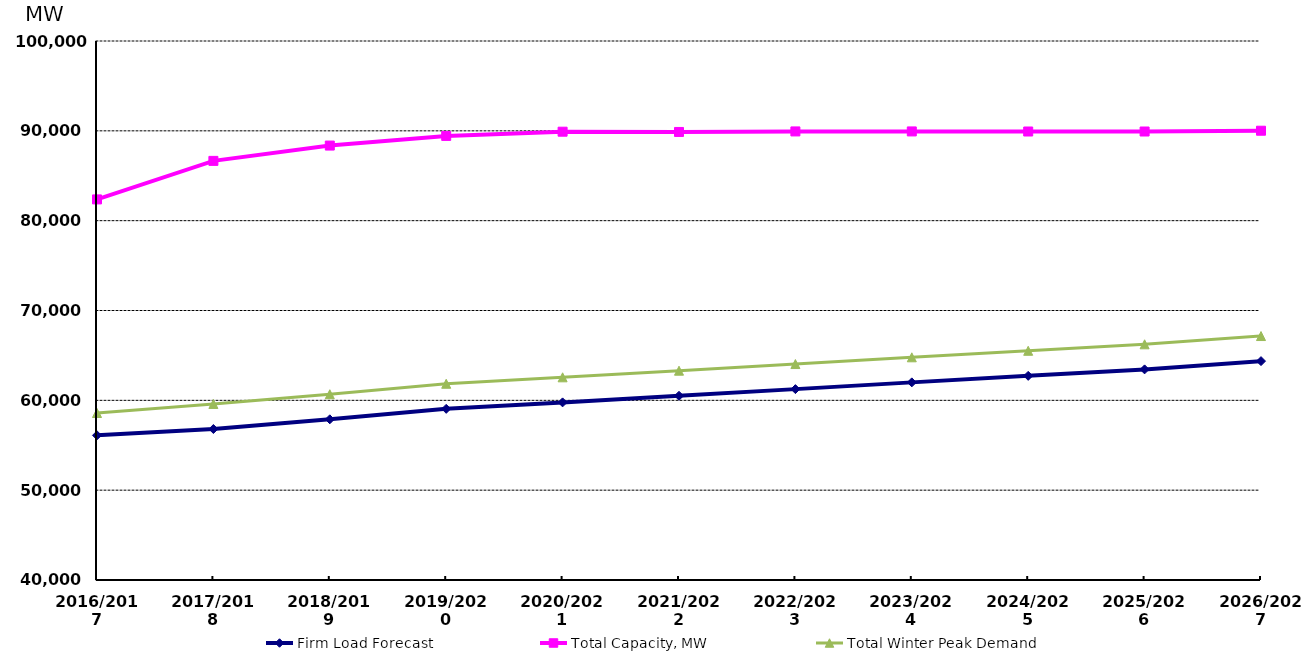
| Category | Firm Load Forecast | Total Capacity, MW | Total Winter Peak Demand |
|---|---|---|---|
| 2016/2017 | 56107.342 | 82366.055 | 58591 |
| 2017/2018 | 56806.342 | 86654.535 | 59597 |
| 2018/2019 | 57888.342 | 88360.185 | 60679 |
| 2019/2020 | 59054.342 | 89434.185 | 61845 |
| 2020/2021 | 59771.342 | 89903.185 | 62562 |
| 2021/2022 | 60508.342 | 89874.185 | 63299 |
| 2022/2023 | 61247.342 | 89934.185 | 64038 |
| 2023/2024 | 61999.342 | 89934.185 | 64790 |
| 2024/2025 | 62725.342 | 89924.185 | 65516 |
| 2025/2026 | 63445.342 | 89924.185 | 66236 |
| 2026/2027 | 64366.022 | 90012.185 | 67156.68 |